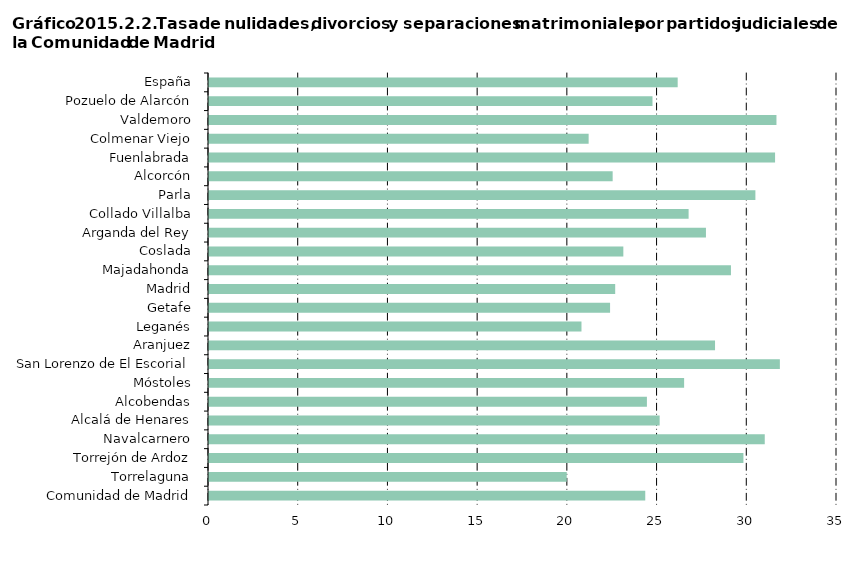
| Category | Series 0 |
|---|---|
| Comunidad de Madrid | 24.314 |
|     Torrelaguna | 19.937 |
|     Torrejón de Ardoz | 29.784 |
|     Navalcarnero | 30.973 |
|     Alcalá de Henares | 25.116 |
|     Alcobendas | 24.406 |
|     Móstoles | 26.48 |
|     San Lorenzo de El Escorial | 31.815 |
|     Aranjuez | 28.203 |
|     Leganés | 20.759 |
|     Getafe | 22.353 |
|     Madrid | 22.639 |
|     Majadahonda | 29.09 |
|     Coslada | 23.092 |
|     Arganda del Rey | 27.696 |
|     Collado Villalba | 26.73 |
|     Parla | 30.452 |
|     Alcorcón | 22.497 |
|     Fuenlabrada | 31.548 |
|     Colmenar Viejo | 21.158 |
|     Valdemoro | 31.626 |
|     Pozuelo de Alarcón | 24.717 |
| España | 26.121 |